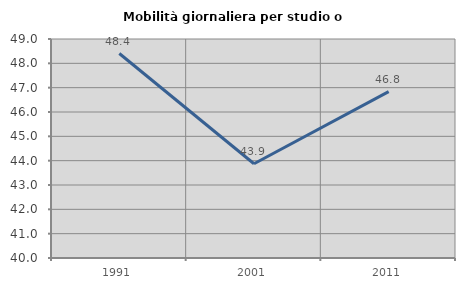
| Category | Mobilità giornaliera per studio o lavoro |
|---|---|
| 1991.0 | 48.404 |
| 2001.0 | 43.874 |
| 2011.0 | 46.837 |